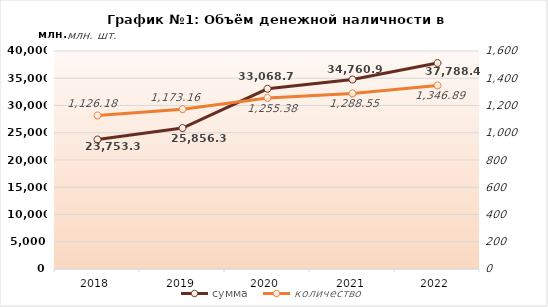
| Category | сумма |
|---|---|
| 2018 | 23753.32 |
| 2019 | 25856.34 |
| 2020 | 33068.73 |
| 2021 | 34760.96 |
| 2022 | 37788.43 |